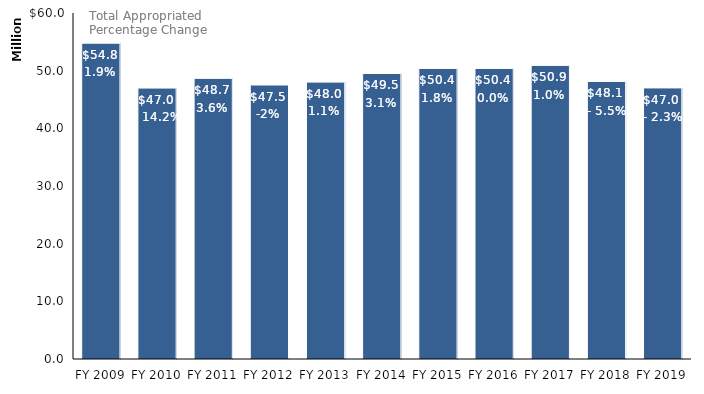
| Category | Appropriations  |
|---|---|
| FY 2009 | 54764597 |
| FY 2010 | 46981467 |
| FY 2011 | 48663935 |
| FY 2012 | 47513448 |
| FY 2013 | 48013448 |
| FY 2014 | 49513448 |
| FY 2015 | 50388448 |
| FY 2016 | 50388448 |
| FY 2017 | 50914681 |
| FY 2018 | 48130951 |
| FY 2019 | 47007171 |